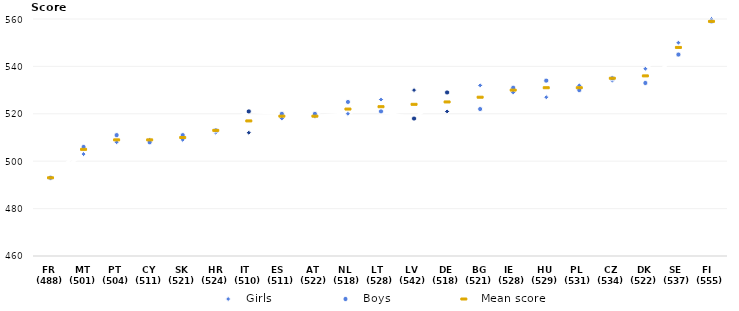
| Category | Girls | Boys | Mean score |
|---|---|---|---|
| FR  (488) | 493 | 493 | 493 |
| MT (501) | 503 | 506 | 505 |
| PT  (504) | 508 | 511 | 509 |
| CY (511) | 509 | 508 | 509 |
| SK (521) | 509 | 511 | 510 |
| HR (524) | 512 | 513 | 513 |
| IT   (510) | 512 | 521 | 517 |
| ES   (511) | 518 | 520 | 519 |
| AT  (522) | 519 | 520 | 519 |
| NL  (518) | 520 | 525 | 522 |
| LT   (528) | 526 | 521 | 523 |
| LV  (542) | 530 | 518 | 524 |
| DE (518) | 521 | 529 | 525 |
| BG (521) | 532 | 522 | 527 |
| IE   (528) | 529 | 531 | 530 |
| HU (529) | 527 | 534 | 531 |
| PL  (531) | 532 | 530 | 531 |
| CZ (534) | 534 | 535 | 535 |
| DK (522) | 539 | 533 | 536 |
| SE  (537) | 550 | 545 | 548 |
| FI   (555) | 560 | 559 | 559 |